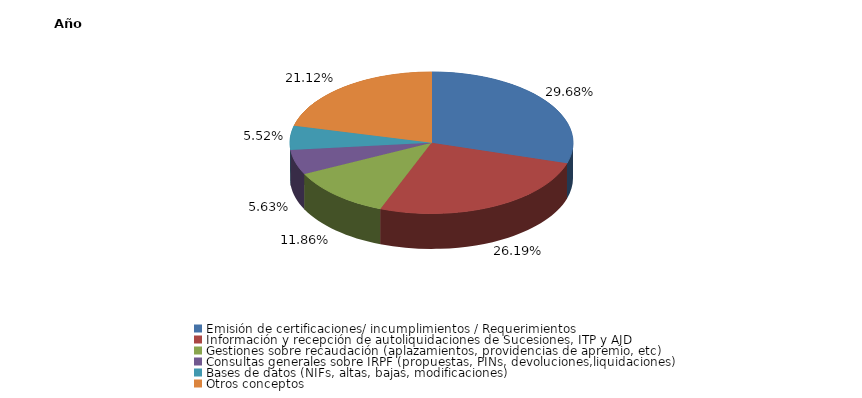
| Category | Series 0 |
|---|---|
| Emisión de certificaciones/ incumplimientos / Requerimientos | 0.297 |
| Información y recepción de autoliquidaciones de Sucesiones, ITP y AJD | 0.262 |
| Gestiones sobre recaudación (aplazamientos, providencias de apremio, etc) | 0.119 |
| Consultas generales sobre IRPF (propuestas, PINs, devoluciones,liquidaciones) | 0.056 |
| Bases de datos (NIFs, altas, bajas, modificaciones) | 0.055 |
| Otros conceptos | 0.211 |